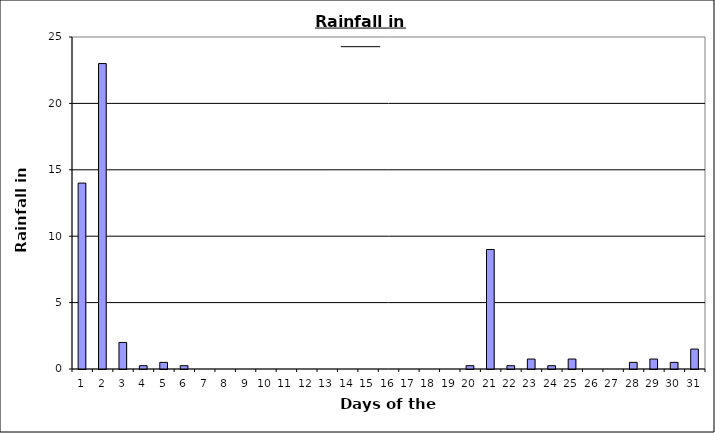
| Category | Series 0 |
|---|---|
| 0 | 14 |
| 1 | 23 |
| 2 | 2 |
| 3 | 0.25 |
| 4 | 0.5 |
| 5 | 0.25 |
| 6 | 0 |
| 7 | 0 |
| 8 | 0 |
| 9 | 0 |
| 10 | 0 |
| 11 | 0 |
| 12 | 0 |
| 13 | 0 |
| 14 | 0 |
| 15 | 0 |
| 16 | 0 |
| 17 | 0 |
| 18 | 0 |
| 19 | 0.25 |
| 20 | 9 |
| 21 | 0.25 |
| 22 | 0.75 |
| 23 | 0.25 |
| 24 | 0.75 |
| 25 | 0 |
| 26 | 0 |
| 27 | 0.5 |
| 28 | 0.75 |
| 29 | 0.5 |
| 30 | 1.5 |